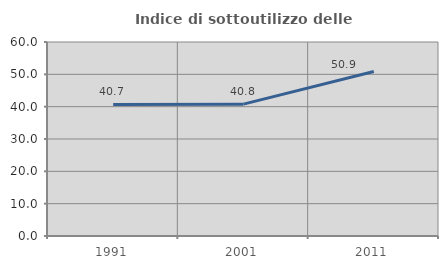
| Category | Indice di sottoutilizzo delle abitazioni  |
|---|---|
| 1991.0 | 40.708 |
| 2001.0 | 40.777 |
| 2011.0 | 50.862 |